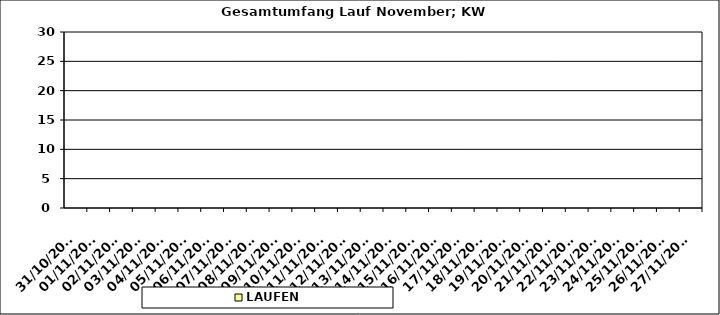
| Category | LAUFEN |
|---|---|
| 31/10/2022 | 0 |
| 01/11/2022 | 0 |
| 02/11/2022 | 0 |
| 03/11/2022 | 0 |
| 04/11/2022 | 0 |
| 05/11/2022 | 0 |
| 06/11/2022 | 0 |
| 07/11/2022 | 0 |
| 08/11/2022 | 0 |
| 09/11/2022 | 0 |
| 10/11/2022 | 0 |
| 11/11/2022 | 0 |
| 12/11/2022 | 0 |
| 13/11/2022 | 0 |
| 14/11/2022 | 0 |
| 15/11/2022 | 0 |
| 16/11/2022 | 0 |
| 17/11/2022 | 0 |
| 18/11/2022 | 0 |
| 19/11/2022 | 0 |
| 20/11/2022 | 0 |
| 21/11/2022 | 0 |
| 22/11/2022 | 0 |
| 23/11/2022 | 0 |
| 24/11/2022 | 0 |
| 25/11/2022 | 0 |
| 26/11/2022 | 0 |
| 27/11/2022 | 0 |